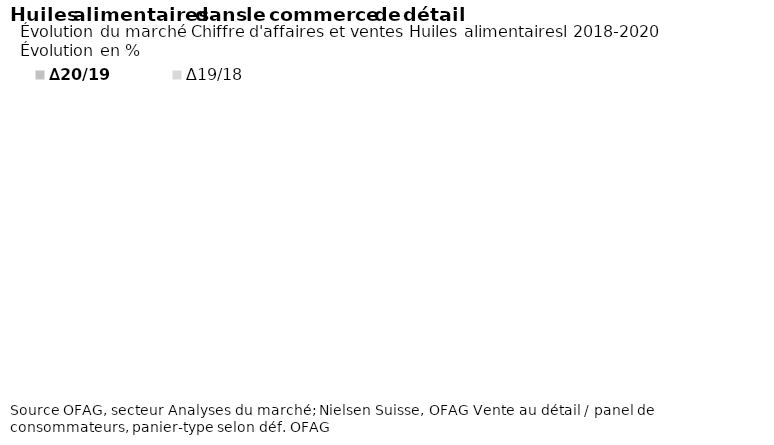
| Category | ∆20/19 | ∆19/18 |
|---|---|---|
| Colza | 8.265 | 1.97 |
| Tournesol | 12.71 | 1.311 |
| Huile d'olive | 11.154 | 5.177 |
| Autres | 8.07 | 0.929 |